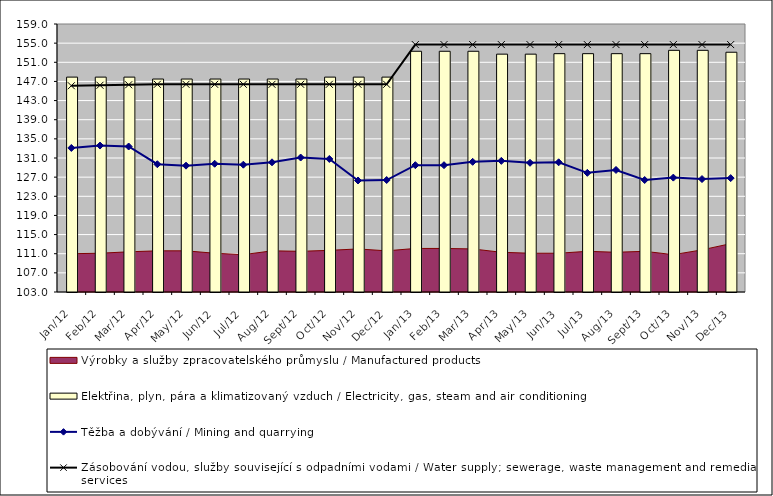
| Category | Elektřina, plyn, pára a klimatizovaný vzduch / Electricity, gas, steam and air conditioning |
|---|---|
| 2012-01-01 | 147.9 |
| 2012-02-01 | 147.9 |
| 2012-03-01 | 147.9 |
| 2012-04-01 | 147.5 |
| 2012-05-01 | 147.5 |
| 2012-06-01 | 147.5 |
| 2012-07-01 | 147.5 |
| 2012-08-01 | 147.5 |
| 2012-09-01 | 147.5 |
| 2012-10-01 | 147.9 |
| 2012-11-01 | 147.9 |
| 2012-12-01 | 147.9 |
| 2013-01-01 | 153.3 |
| 2013-02-01 | 153.3 |
| 2013-03-01 | 153.3 |
| 2013-04-01 | 152.7 |
| 2013-05-01 | 152.7 |
| 2013-06-01 | 152.8 |
| 2013-07-01 | 152.8 |
| 2013-08-01 | 152.8 |
| 2013-09-01 | 152.8 |
| 2013-10-01 | 153.5 |
| 2013-11-01 | 153.5 |
| 2013-12-01 | 153.1 |